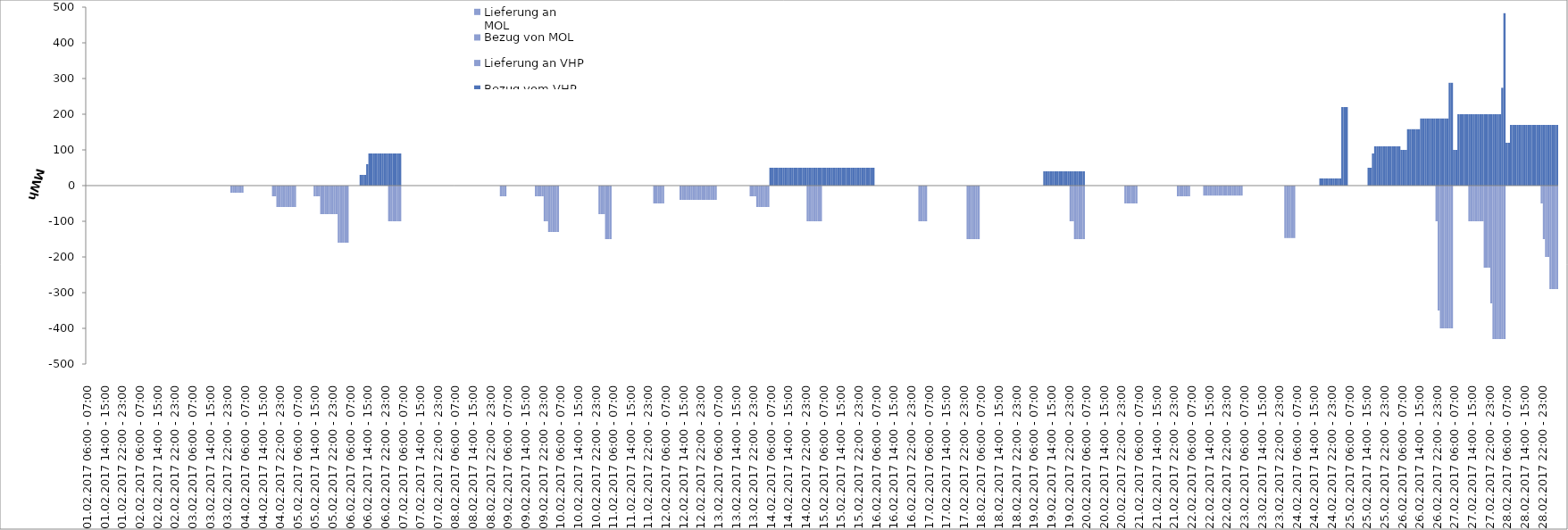
| Category | Bezug vom VHP | Lieferung an VHP | Bezug von MOL | Lieferung an MOL |
|---|---|---|---|---|
| 01.02.2017 06:00 - 07:00 | 0 | 0 | 0 | 0 |
| 01.02.2017 07:00 - 08:00 | 0 | 0 | 0 | 0 |
| 01.02.2017 08:00 - 09:00 | 0 | 0 | 0 | 0 |
| 01.02.2017 09:00 - 10:00 | 0 | 0 | 0 | 0 |
| 01.02.2017 10:00 - 11:00 | 0 | 0 | 0 | 0 |
| 01.02.2017 11:00 - 12:00 | 0 | 0 | 0 | 0 |
| 01.02.2017 12:00 - 13:00 | 0 | 0 | 0 | 0 |
| 01.02.2017 13:00 - 14:00 | 0 | 0 | 0 | 0 |
| 01.02.2017 14:00 - 15:00 | 0 | 0 | 0 | 0 |
| 01.02.2017 15:00 - 16:00 | 0 | 0 | 0 | 0 |
| 01.02.2017 16:00 - 17:00 | 0 | 0 | 0 | 0 |
| 01.02.2017 17:00 - 18:00 | 0 | 0 | 0 | 0 |
| 01.02.2017 18:00 - 19:00 | 0 | 0 | 0 | 0 |
| 01.02.2017 19:00 - 20:00 | 0 | 0 | 0 | 0 |
| 01.02.2017 20:00 - 21:00 | 0 | 0 | 0 | 0 |
| 01.02.2017 21:00 - 22:00 | 0 | 0 | 0 | 0 |
| 01.02.2017 22:00 - 23:00 | 0 | 0 | 0 | 0 |
| 01.02.2017 23:00 - 24:00 | 0 | 0 | 0 | 0 |
| 02.02.2017 00:00 - 01:00 | 0 | 0 | 0 | 0 |
| 02.02.2017 01:00 - 02:00 | 0 | 0 | 0 | 0 |
| 02.02.2017 02:00 - 03:00 | 0 | 0 | 0 | 0 |
| 02.02.2017 03:00 - 04:00 | 0 | 0 | 0 | 0 |
| 02.02.2017 04:00 - 05:00 | 0 | 0 | 0 | 0 |
| 02.02.2017 05:00 - 06:00 | 0 | 0 | 0 | 0 |
| 02.02.2017 06:00 - 07:00 | 0 | 0 | 0 | 0 |
| 02.02.2017 07:00 - 08:00 | 0 | 0 | 0 | 0 |
| 02.02.2017 08:00 - 09:00 | 0 | 0 | 0 | 0 |
| 02.02.2017 09:00 - 10:00 | 0 | 0 | 0 | 0 |
| 02.02.2017 10:00 - 11:00 | 0 | 0 | 0 | 0 |
| 02.02.2017 11:00 - 12:00 | 0 | 0 | 0 | 0 |
| 02.02.2017 12:00 - 13:00 | 0 | 0 | 0 | 0 |
| 02.02.2017 13:00 - 14:00 | 0 | 0 | 0 | 0 |
| 02.02.2017 14:00 - 15:00 | 0 | 0 | 0 | 0 |
| 02.02.2017 15:00 - 16:00 | 0 | 0 | 0 | 0 |
| 02.02.2017 16:00 - 17:00 | 0 | 0 | 0 | 0 |
| 02.02.2017 17:00 - 18:00 | 0 | 0 | 0 | 0 |
| 02.02.2017 18:00 - 19:00 | 0 | 0 | 0 | 0 |
| 02.02.2017 19:00 - 20:00 | 0 | 0 | 0 | 0 |
| 02.02.2017 20:00 - 21:00 | 0 | 0 | 0 | 0 |
| 02.02.2017 21:00 - 22:00 | 0 | 0 | 0 | 0 |
| 02.02.2017 22:00 - 23:00 | 0 | 0 | 0 | 0 |
| 02.02.2017 23:00 - 24:00 | 0 | 0 | 0 | 0 |
| 03.02.2017 00:00 - 01:00 | 0 | 0 | 0 | 0 |
| 03.02.2017 01:00 - 02:00 | 0 | 0 | 0 | 0 |
| 03.02.2017 02:00 - 03:00 | 0 | 0 | 0 | 0 |
| 03.02.2017 03:00 - 04:00 | 0 | 0 | 0 | 0 |
| 03.02.2017 04:00 - 05:00 | 0 | 0 | 0 | 0 |
| 03.02.2017 05:00 - 06:00 | 0 | 0 | 0 | 0 |
| 03.02.2017 06:00 - 07:00 | 0 | 0 | 0 | 0 |
| 03.02.2017 07:00 - 08:00 | 0 | 0 | 0 | 0 |
| 03.02.2017 08:00 - 09:00 | 0 | 0 | 0 | 0 |
| 03.02.2017 09:00 - 10:00 | 0 | 0 | 0 | 0 |
| 03.02.2017 10:00 - 11:00 | 0 | 0 | 0 | 0 |
| 03.02.2017 11:00 - 12:00 | 0 | 0 | 0 | 0 |
| 03.02.2017 12:00 - 13:00 | 0 | 0 | 0 | 0 |
| 03.02.2017 13:00 - 14:00 | 0 | 0 | 0 | 0 |
| 03.02.2017 14:00 - 15:00 | 0 | 0 | 0 | 0 |
| 03.02.2017 15:00 - 16:00 | 0 | 0 | 0 | 0 |
| 03.02.2017 16:00 - 17:00 | 0 | 0 | 0 | 0 |
| 03.02.2017 17:00 - 18:00 | 0 | 0 | 0 | 0 |
| 03.02.2017 18:00 - 19:00 | 0 | 0 | 0 | 0 |
| 03.02.2017 19:00 - 20:00 | 0 | 0 | 0 | 0 |
| 03.02.2017 20:00 - 21:00 | 0 | 0 | 0 | 0 |
| 03.02.2017 21:00 - 22:00 | 0 | 0 | 0 | 0 |
| 03.02.2017 22:00 - 23:00 | 0 | 0 | 0 | 0 |
| 03.02.2017 23:00 - 24:00 | 0 | 0 | 0 | 0 |
| 04.02.2017 00:00 - 01:00 | 0 | -20 | 0 | 0 |
| 04.02.2017 01:00 - 02:00 | 0 | -20 | 0 | 0 |
| 04.02.2017 02:00 - 03:00 | 0 | -20 | 0 | 0 |
| 04.02.2017 03:00 - 04:00 | 0 | -20 | 0 | 0 |
| 04.02.2017 04:00 - 05:00 | 0 | -20 | 0 | 0 |
| 04.02.2017 05:00 - 06:00 | 0 | -20 | 0 | 0 |
| 04.02.2017 06:00 - 07:00 | 0 | 0 | 0 | 0 |
| 04.02.2017 07:00 - 08:00 | 0 | 0 | 0 | 0 |
| 04.02.2017 08:00 - 09:00 | 0 | 0 | 0 | 0 |
| 04.02.2017 09:00 - 10:00 | 0 | 0 | 0 | 0 |
| 04.02.2017 10:00 - 11:00 | 0 | 0 | 0 | 0 |
| 04.02.2017 11:00 - 12:00 | 0 | 0 | 0 | 0 |
| 04.02.2017 12:00 - 13:00 | 0 | 0 | 0 | 0 |
| 04.02.2017 13:00 - 14:00 | 0 | 0 | 0 | 0 |
| 04.02.2017 14:00 - 15:00 | 0 | 0 | 0 | 0 |
| 04.02.2017 15:00 - 16:00 | 0 | 0 | 0 | 0 |
| 04.02.2017 16:00 - 17:00 | 0 | 0 | 0 | 0 |
| 04.02.2017 17:00 - 18:00 | 0 | 0 | 0 | 0 |
| 04.02.2017 18:00 - 19:00 | 0 | 0 | 0 | 0 |
| 04.02.2017 19:00 - 20:00 | 0 | -30 | 0 | 0 |
| 04.02.2017 20:00 - 21:00 | 0 | -30 | 0 | 0 |
| 04.02.2017 21:00 - 22:00 | 0 | -60 | 0 | 0 |
| 04.02.2017 22:00 - 23:00 | 0 | -60 | 0 | 0 |
| 04.02.2017 23:00 - 24:00 | 0 | -60 | 0 | 0 |
| 05.02.2017 00:00 - 01:00 | 0 | -60 | 0 | 0 |
| 05.02.2017 01:00 - 02:00 | 0 | -60 | 0 | 0 |
| 05.02.2017 02:00 - 03:00 | 0 | -60 | 0 | 0 |
| 05.02.2017 03:00 - 04:00 | 0 | -60 | 0 | 0 |
| 05.02.2017 04:00 - 05:00 | 0 | -60 | 0 | 0 |
| 05.02.2017 05:00 - 06:00 | 0 | -60 | 0 | 0 |
| 05.02.2017 06:00 - 07:00 | 0 | 0 | 0 | 0 |
| 05.02.2017 07:00 - 08:00 | 0 | 0 | 0 | 0 |
| 05.02.2017 08:00 - 09:00 | 0 | 0 | 0 | 0 |
| 05.02.2017 09:00 - 10:00 | 0 | 0 | 0 | 0 |
| 05.02.2017 10:00 - 11:00 | 0 | 0 | 0 | 0 |
| 05.02.2017 11:00 - 12:00 | 0 | 0 | 0 | 0 |
| 05.02.2017 12:00 - 13:00 | 0 | 0 | 0 | 0 |
| 05.02.2017 13:00 - 14:00 | 0 | 0 | 0 | 0 |
| 05.02.2017 14:00 - 15:00 | 0 | -30 | 0 | 0 |
| 05.02.2017 15:00 - 16:00 | 0 | -30 | 0 | 0 |
| 05.02.2017 16:00 - 17:00 | 0 | -30 | 0 | 0 |
| 05.02.2017 17:00 - 18:00 | 0 | -80 | 0 | 0 |
| 05.02.2017 18:00 - 19:00 | 0 | -80 | 0 | 0 |
| 05.02.2017 19:00 - 20:00 | 0 | -80 | 0 | 0 |
| 05.02.2017 20:00 - 21:00 | 0 | -80 | 0 | 0 |
| 05.02.2017 21:00 - 22:00 | 0 | -80 | 0 | 0 |
| 05.02.2017 22:00 - 23:00 | 0 | -80 | 0 | 0 |
| 05.02.2017 23:00 - 24:00 | 0 | -80 | 0 | 0 |
| 06.02.2017 00:00 - 01:00 | 0 | -80 | 0 | 0 |
| 06.02.2017 01:00 - 02:00 | 0 | -160 | 0 | 0 |
| 06.02.2017 02:00 - 03:00 | 0 | -160 | 0 | 0 |
| 06.02.2017 03:00 - 04:00 | 0 | -160 | 0 | 0 |
| 06.02.2017 04:00 - 05:00 | 0 | -160 | 0 | 0 |
| 06.02.2017 05:00 - 06:00 | 0 | -160 | 0 | 0 |
| 06.02.2017 06:00 - 07:00 | 0 | 0 | 0 | 0 |
| 06.02.2017 07:00 - 08:00 | 0 | 0 | 0 | 0 |
| 06.02.2017 08:00 - 09:00 | 0 | 0 | 0 | 0 |
| 06.02.2017 09:00 - 10:00 | 0 | 0 | 0 | 0 |
| 06.02.2017 10:00 - 11:00 | 0 | 0 | 0 | 0 |
| 06.02.2017 11:00 - 12:00 | 30 | 0 | 0 | 0 |
| 06.02.2017 12:00 - 13:00 | 30 | 0 | 0 | 0 |
| 06.02.2017 13:00 - 14:00 | 30 | 0 | 0 | 0 |
| 06.02.2017 14:00 - 15:00 | 60 | 0 | 0 | 0 |
| 06.02.2017 15:00 - 16:00 | 90 | 0 | 0 | 0 |
| 06.02.2017 16:00 - 17:00 | 90 | 0 | 0 | 0 |
| 06.02.2017 17:00 - 18:00 | 90 | 0 | 0 | 0 |
| 06.02.2017 18:00 - 19:00 | 90 | 0 | 0 | 0 |
| 06.02.2017 19:00 - 20:00 | 90 | 0 | 0 | 0 |
| 06.02.2017 20:00 - 21:00 | 90 | 0 | 0 | 0 |
| 06.02.2017 21:00 - 22:00 | 90 | 0 | 0 | 0 |
| 06.02.2017 22:00 - 23:00 | 90 | 0 | 0 | 0 |
| 06.02.2017 23:00 - 24:00 | 90 | 0 | 0 | 0 |
| 07.02.2017 00:00 - 01:00 | 90 | -100 | 0 | 0 |
| 07.02.2017 01:00 - 02:00 | 90 | -100 | 0 | 0 |
| 07.02.2017 02:00 - 03:00 | 90 | -100 | 0 | 0 |
| 07.02.2017 03:00 - 04:00 | 90 | -100 | 0 | 0 |
| 07.02.2017 04:00 - 05:00 | 90 | -100 | 0 | 0 |
| 07.02.2017 05:00 - 06:00 | 90 | -100 | 0 | 0 |
| 07.02.2017 06:00 - 07:00 | 0 | 0 | 0 | 0 |
| 07.02.2017 07:00 - 08:00 | 0 | 0 | 0 | 0 |
| 07.02.2017 08:00 - 09:00 | 0 | 0 | 0 | 0 |
| 07.02.2017 09:00 - 10:00 | 0 | 0 | 0 | 0 |
| 07.02.2017 10:00 - 11:00 | 0 | 0 | 0 | 0 |
| 07.02.2017 11:00 - 12:00 | 0 | 0 | 0 | 0 |
| 07.02.2017 12:00 - 13:00 | 0 | 0 | 0 | 0 |
| 07.02.2017 13:00 - 14:00 | 0 | 0 | 0 | 0 |
| 07.02.2017 14:00 - 15:00 | 0 | 0 | 0 | 0 |
| 07.02.2017 15:00 - 16:00 | 0 | 0 | 0 | 0 |
| 07.02.2017 16:00 - 17:00 | 0 | 0 | 0 | 0 |
| 07.02.2017 17:00 - 18:00 | 0 | 0 | 0 | 0 |
| 07.02.2017 18:00 - 19:00 | 0 | 0 | 0 | 0 |
| 07.02.2017 19:00 - 20:00 | 0 | 0 | 0 | 0 |
| 07.02.2017 20:00 - 21:00 | 0 | 0 | 0 | 0 |
| 07.02.2017 21:00 - 22:00 | 0 | 0 | 0 | 0 |
| 07.02.2017 22:00 - 23:00 | 0 | 0 | 0 | 0 |
| 07.02.2017 23:00 - 24:00 | 0 | 0 | 0 | 0 |
| 08.02.2017 00:00 - 01:00 | 0 | 0 | 0 | 0 |
| 08.02.2017 01:00 - 02:00 | 0 | 0 | 0 | 0 |
| 08.02.2017 02:00 - 03:00 | 0 | 0 | 0 | 0 |
| 08.02.2017 03:00 - 04:00 | 0 | 0 | 0 | 0 |
| 08.02.2017 04:00 - 05:00 | 0 | 0 | 0 | 0 |
| 08.02.2017 05:00 - 06:00 | 0 | 0 | 0 | 0 |
| 08.02.2017 06:00 - 07:00 | 0 | 0 | 0 | 0 |
| 08.02.2017 07:00 - 08:00 | 0 | 0 | 0 | 0 |
| 08.02.2017 08:00 - 09:00 | 0 | 0 | 0 | 0 |
| 08.02.2017 09:00 - 10:00 | 0 | 0 | 0 | 0 |
| 08.02.2017 10:00 - 11:00 | 0 | 0 | 0 | 0 |
| 08.02.2017 11:00 - 12:00 | 0 | 0 | 0 | 0 |
| 08.02.2017 12:00 - 13:00 | 0 | 0 | 0 | 0 |
| 08.02.2017 13:00 - 14:00 | 0 | 0 | 0 | 0 |
| 08.02.2017 14:00 - 15:00 | 0 | 0 | 0 | 0 |
| 08.02.2017 15:00 - 16:00 | 0 | 0 | 0 | 0 |
| 08.02.2017 16:00 - 17:00 | 0 | 0 | 0 | 0 |
| 08.02.2017 17:00 - 18:00 | 0 | 0 | 0 | 0 |
| 08.02.2017 18:00 - 19:00 | 0 | 0 | 0 | 0 |
| 08.02.2017 19:00 - 20:00 | 0 | 0 | 0 | 0 |
| 08.02.2017 20:00 - 21:00 | 0 | 0 | 0 | 0 |
| 08.02.2017 21:00 - 22:00 | 0 | 0 | 0 | 0 |
| 08.02.2017 22:00 - 23:00 | 0 | 0 | 0 | 0 |
| 08.02.2017 23:00 - 24:00 | 0 | 0 | 0 | 0 |
| 09.02.2017 00:00 - 01:00 | 0 | 0 | 0 | 0 |
| 09.02.2017 01:00 - 02:00 | 0 | 0 | 0 | 0 |
| 09.02.2017 02:00 - 03:00 | 0 | 0 | 0 | 0 |
| 09.02.2017 03:00 - 04:00 | 0 | -30 | 0 | 0 |
| 09.02.2017 04:00 - 05:00 | 0 | -30 | 0 | 0 |
| 09.02.2017 05:00 - 06:00 | 0 | -30 | 0 | 0 |
| 09.02.2017 06:00 - 07:00 | 0 | 0 | 0 | 0 |
| 09.02.2017 07:00 - 08:00 | 0 | 0 | 0 | 0 |
| 09.02.2017 08:00 - 09:00 | 0 | 0 | 0 | 0 |
| 09.02.2017 09:00 - 10:00 | 0 | 0 | 0 | 0 |
| 09.02.2017 10:00 - 11:00 | 0 | 0 | 0 | 0 |
| 09.02.2017 11:00 - 12:00 | 0 | 0 | 0 | 0 |
| 09.02.2017 12:00 - 13:00 | 0 | 0 | 0 | 0 |
| 09.02.2017 13:00 - 14:00 | 0 | 0 | 0 | 0 |
| 09.02.2017 14:00 - 15:00 | 0 | 0 | 0 | 0 |
| 09.02.2017 15:00 - 16:00 | 0 | 0 | 0 | 0 |
| 09.02.2017 16:00 - 17:00 | 0 | 0 | 0 | 0 |
| 09.02.2017 17:00 - 18:00 | 0 | 0 | 0 | 0 |
| 09.02.2017 18:00 - 19:00 | 0 | 0 | 0 | 0 |
| 09.02.2017 19:00 - 20:00 | 0 | -30 | 0 | 0 |
| 09.02.2017 20:00 - 21:00 | 0 | -30 | 0 | 0 |
| 09.02.2017 21:00 - 22:00 | 0 | -30 | 0 | 0 |
| 09.02.2017 22:00 - 23:00 | 0 | -30 | 0 | 0 |
| 09.02.2017 23:00 - 24:00 | 0 | -100 | 0 | 0 |
| 10.02.2017 00:00 - 01:00 | 0 | -100 | 0 | 0 |
| 10.02.2017 01:00 - 02:00 | 0 | -130 | 0 | 0 |
| 10.02.2017 02:00 - 03:00 | 0 | -130 | 0 | 0 |
| 10.02.2017 03:00 - 04:00 | 0 | -130 | 0 | 0 |
| 10.02.2017 04:00 - 05:00 | 0 | -130 | 0 | 0 |
| 10.02.2017 05:00 - 06:00 | 0 | -130 | 0 | 0 |
| 10.02.2017 06:00 - 07:00 | 0 | 0 | 0 | 0 |
| 10.02.2017 07:00 - 08:00 | 0 | 0 | 0 | 0 |
| 10.02.2017 08:00 - 09:00 | 0 | 0 | 0 | 0 |
| 10.02.2017 09:00 - 10:00 | 0 | 0 | 0 | 0 |
| 10.02.2017 10:00 - 11:00 | 0 | 0 | 0 | 0 |
| 10.02.2017 11:00 - 12:00 | 0 | 0 | 0 | 0 |
| 10.02.2017 12:00 - 13:00 | 0 | 0 | 0 | 0 |
| 10.02.2017 13:00 - 14:00 | 0 | 0 | 0 | 0 |
| 10.02.2017 14:00 - 15:00 | 0 | 0 | 0 | 0 |
| 10.02.2017 15:00 - 16:00 | 0 | 0 | 0 | 0 |
| 10.02.2017 16:00 - 17:00 | 0 | 0 | 0 | 0 |
| 10.02.2017 17:00 - 18:00 | 0 | 0 | 0 | 0 |
| 10.02.2017 18:00 - 19:00 | 0 | 0 | 0 | 0 |
| 10.02.2017 19:00 - 20:00 | 0 | 0 | 0 | 0 |
| 10.02.2017 20:00 - 21:00 | 0 | 0 | 0 | 0 |
| 10.02.2017 21:00 - 22:00 | 0 | 0 | 0 | 0 |
| 10.02.2017 22:00 - 23:00 | 0 | 0 | 0 | 0 |
| 10.02.2017 23:00 - 24:00 | 0 | 0 | 0 | 0 |
| 11.02.2017 00:00 - 01:00 | 0 | -80 | 0 | 0 |
| 11.02.2017 01:00 - 02:00 | 0 | -80 | 0 | 0 |
| 11.02.2017 02:00 - 03:00 | 0 | -80 | 0 | 0 |
| 11.02.2017 03:00 - 04:00 | 0 | -150 | 0 | 0 |
| 11.02.2017 04:00 - 05:00 | 0 | -150 | 0 | 0 |
| 11.02.2017 05:00 - 06:00 | 0 | -150 | 0 | 0 |
| 11.02.2017 06:00 - 07:00 | 0 | 0 | 0 | 0 |
| 11.02.2017 07:00 - 08:00 | 0 | 0 | 0 | 0 |
| 11.02.2017 08:00 - 09:00 | 0 | 0 | 0 | 0 |
| 11.02.2017 09:00 - 10:00 | 0 | 0 | 0 | 0 |
| 11.02.2017 10:00 - 11:00 | 0 | 0 | 0 | 0 |
| 11.02.2017 11:00 - 12:00 | 0 | 0 | 0 | 0 |
| 11.02.2017 12:00 - 13:00 | 0 | 0 | 0 | 0 |
| 11.02.2017 13:00 - 14:00 | 0 | 0 | 0 | 0 |
| 11.02.2017 14:00 - 15:00 | 0 | 0 | 0 | 0 |
| 11.02.2017 15:00 - 16:00 | 0 | 0 | 0 | 0 |
| 11.02.2017 16:00 - 17:00 | 0 | 0 | 0 | 0 |
| 11.02.2017 17:00 - 18:00 | 0 | 0 | 0 | 0 |
| 11.02.2017 18:00 - 19:00 | 0 | 0 | 0 | 0 |
| 11.02.2017 19:00 - 20:00 | 0 | 0 | 0 | 0 |
| 11.02.2017 20:00 - 21:00 | 0 | 0 | 0 | 0 |
| 11.02.2017 21:00 - 22:00 | 0 | 0 | 0 | 0 |
| 11.02.2017 22:00 - 23:00 | 0 | 0 | 0 | 0 |
| 11.02.2017 23:00 - 24:00 | 0 | 0 | 0 | 0 |
| 12.02.2017 00:00 - 01:00 | 0 | 0 | 0 | 0 |
| 12.02.2017 01:00 - 02:00 | 0 | -50 | 0 | 0 |
| 12.02.2017 02:00 - 03:00 | 0 | -50 | 0 | 0 |
| 12.02.2017 03:00 - 04:00 | 0 | -50 | 0 | 0 |
| 12.02.2017 04:00 - 05:00 | 0 | -50 | 0 | 0 |
| 12.02.2017 05:00 - 06:00 | 0 | -50 | 0 | 0 |
| 12.02.2017 06:00 - 07:00 | 0 | 0 | 0 | 0 |
| 12.02.2017 07:00 - 08:00 | 0 | 0 | 0 | 0 |
| 12.02.2017 08:00 - 09:00 | 0 | 0 | 0 | 0 |
| 12.02.2017 09:00 - 10:00 | 0 | 0 | 0 | 0 |
| 12.02.2017 10:00 - 11:00 | 0 | 0 | 0 | 0 |
| 12.02.2017 11:00 - 12:00 | 0 | 0 | 0 | 0 |
| 12.02.2017 12:00 - 13:00 | 0 | 0 | 0 | 0 |
| 12.02.2017 13:00 - 14:00 | 0 | -40 | 0 | 0 |
| 12.02.2017 14:00 - 15:00 | 0 | -40 | 0 | 0 |
| 12.02.2017 15:00 - 16:00 | 0 | -40 | 0 | 0 |
| 12.02.2017 16:00 - 17:00 | 0 | -40 | 0 | 0 |
| 12.02.2017 17:00 - 18:00 | 0 | -40 | 0 | 0 |
| 12.02.2017 18:00 - 19:00 | 0 | -40 | 0 | 0 |
| 12.02.2017 19:00 - 20:00 | 0 | -40 | 0 | 0 |
| 12.02.2017 20:00 - 21:00 | 0 | -40 | 0 | 0 |
| 12.02.2017 21:00 - 22:00 | 0 | -40 | 0 | 0 |
| 12.02.2017 22:00 - 23:00 | 0 | -40 | 0 | 0 |
| 12.02.2017 23:00 - 24:00 | 0 | -40 | 0 | 0 |
| 13.02.2017 00:00 - 01:00 | 0 | -40 | 0 | 0 |
| 13.02.2017 01:00 - 02:00 | 0 | -40 | 0 | 0 |
| 13.02.2017 02:00 - 03:00 | 0 | -40 | 0 | 0 |
| 13.02.2017 03:00 - 04:00 | 0 | -40 | 0 | 0 |
| 13.02.2017 04:00 - 05:00 | 0 | -40 | 0 | 0 |
| 13.02.2017 05:00 - 06:00 | 0 | -40 | 0 | 0 |
| 13.02.2017 06:00 - 07:00 | 0 | 0 | 0 | 0 |
| 13.02.2017 07:00 - 08:00 | 0 | 0 | 0 | 0 |
| 13.02.2017 08:00 - 09:00 | 0 | 0 | 0 | 0 |
| 13.02.2017 09:00 - 10:00 | 0 | 0 | 0 | 0 |
| 13.02.2017 10:00 - 11:00 | 0 | 0 | 0 | 0 |
| 13.02.2017 11:00 - 12:00 | 0 | 0 | 0 | 0 |
| 13.02.2017 12:00 - 13:00 | 0 | 0 | 0 | 0 |
| 13.02.2017 13:00 - 14:00 | 0 | 0 | 0 | 0 |
| 13.02.2017 14:00 - 15:00 | 0 | 0 | 0 | 0 |
| 13.02.2017 15:00 - 16:00 | 0 | 0 | 0 | 0 |
| 13.02.2017 16:00 - 17:00 | 0 | 0 | 0 | 0 |
| 13.02.2017 17:00 - 18:00 | 0 | 0 | 0 | 0 |
| 13.02.2017 18:00 - 19:00 | 0 | 0 | 0 | 0 |
| 13.02.2017 19:00 - 20:00 | 0 | 0 | 0 | 0 |
| 13.02.2017 20:00 - 21:00 | 0 | 0 | 0 | 0 |
| 13.02.2017 21:00 - 22:00 | 0 | -30 | 0 | 0 |
| 13.02.2017 22:00 - 23:00 | 0 | -30 | 0 | 0 |
| 13.02.2017 23:00 - 24:00 | 0 | -30 | 0 | 0 |
| 14.02.2017 00:00 - 01:00 | 0 | -60 | 0 | 0 |
| 14.02.2017 01:00 - 02:00 | 0 | -60 | 0 | 0 |
| 14.02.2017 02:00 - 03:00 | 0 | -60 | 0 | 0 |
| 14.02.2017 03:00 - 04:00 | 0 | -60 | 0 | 0 |
| 14.02.2017 04:00 - 05:00 | 0 | -60 | 0 | 0 |
| 14.02.2017 05:00 - 06:00 | 0 | -60 | 0 | 0 |
| 14.02.2017 06:00 - 07:00 | 50 | 0 | 0 | 0 |
| 14.02.2017 07:00 - 08:00 | 50 | 0 | 0 | 0 |
| 14.02.2017 08:00 - 09:00 | 50 | 0 | 0 | 0 |
| 14.02.2017 09:00 - 10:00 | 50 | 0 | 0 | 0 |
| 14.02.2017 10:00 - 11:00 | 50 | 0 | 0 | 0 |
| 14.02.2017 11:00 - 12:00 | 50 | 0 | 0 | 0 |
| 14.02.2017 12:00 - 13:00 | 50 | 0 | 0 | 0 |
| 14.02.2017 13:00 - 14:00 | 50 | 0 | 0 | 0 |
| 14.02.2017 14:00 - 15:00 | 50 | 0 | 0 | 0 |
| 14.02.2017 15:00 - 16:00 | 50 | 0 | 0 | 0 |
| 14.02.2017 16:00 - 17:00 | 50 | 0 | 0 | 0 |
| 14.02.2017 17:00 - 18:00 | 50 | 0 | 0 | 0 |
| 14.02.2017 18:00 - 19:00 | 50 | 0 | 0 | 0 |
| 14.02.2017 19:00 - 20:00 | 50 | 0 | 0 | 0 |
| 14.02.2017 20:00 - 21:00 | 50 | 0 | 0 | 0 |
| 14.02.2017 21:00 - 22:00 | 50 | 0 | 0 | 0 |
| 14.02.2017 22:00 - 23:00 | 50 | 0 | 0 | 0 |
| 14.02.2017 23:00 - 24:00 | 50 | -100 | 0 | 0 |
| 15.02.2017 00:00 - 01:00 | 50 | -100 | 0 | 0 |
| 15.02.2017 01:00 - 02:00 | 50 | -100 | 0 | 0 |
| 15.02.2017 02:00 - 03:00 | 50 | -100 | 0 | 0 |
| 15.02.2017 03:00 - 04:00 | 50 | -100 | 0 | 0 |
| 15.02.2017 04:00 - 05:00 | 50 | -100 | 0 | 0 |
| 15.02.2017 05:00 - 06:00 | 50 | -100 | 0 | 0 |
| 15.02.2017 06:00 - 07:00 | 50 | 0 | 0 | 0 |
| 15.02.2017 07:00 - 08:00 | 50 | 0 | 0 | 0 |
| 15.02.2017 08:00 - 09:00 | 50 | 0 | 0 | 0 |
| 15.02.2017 09:00 - 10:00 | 50 | 0 | 0 | 0 |
| 15.02.2017 10:00 - 11:00 | 50 | 0 | 0 | 0 |
| 15.02.2017 11:00 - 12:00 | 50 | 0 | 0 | 0 |
| 15.02.2017 12:00 - 13:00 | 50 | 0 | 0 | 0 |
| 15.02.2017 13:00 - 14:00 | 50 | 0 | 0 | 0 |
| 15.02.2017 14:00 - 15:00 | 50 | 0 | 0 | 0 |
| 15.02.2017 15:00 - 16:00 | 50 | 0 | 0 | 0 |
| 15.02.2017 16:00 - 17:00 | 50 | 0 | 0 | 0 |
| 15.02.2017 17:00 - 18:00 | 50 | 0 | 0 | 0 |
| 15.02.2017 18:00 - 19:00 | 50 | 0 | 0 | 0 |
| 15.02.2017 19:00 - 20:00 | 50 | 0 | 0 | 0 |
| 15.02.2017 20:00 - 21:00 | 50 | 0 | 0 | 0 |
| 15.02.2017 21:00 - 22:00 | 50 | 0 | 0 | 0 |
| 15.02.2017 22:00 - 23:00 | 50 | 0 | 0 | 0 |
| 15.02.2017 23:00 - 24:00 | 50 | 0 | 0 | 0 |
| 16.02.2017 00:00 - 01:00 | 50 | 0 | 0 | 0 |
| 16.02.2017 01:00 - 02:00 | 50 | 0 | 0 | 0 |
| 16.02.2017 02:00 - 03:00 | 50 | 0 | 0 | 0 |
| 16.02.2017 03:00 - 04:00 | 50 | 0 | 0 | 0 |
| 16.02.2017 04:00 - 05:00 | 50 | 0 | 0 | 0 |
| 16.02.2017 05:00 - 06:00 | 50 | 0 | 0 | 0 |
| 16.02.2017 06:00 - 07:00 | 0 | 0 | 0 | 0 |
| 16.02.2017 07:00 - 08:00 | 0 | 0 | 0 | 0 |
| 16.02.2017 08:00 - 09:00 | 0 | 0 | 0 | 0 |
| 16.02.2017 09:00 - 10:00 | 0 | 0 | 0 | 0 |
| 16.02.2017 10:00 - 11:00 | 0 | 0 | 0 | 0 |
| 16.02.2017 11:00 - 12:00 | 0 | 0 | 0 | 0 |
| 16.02.2017 12:00 - 13:00 | 0 | 0 | 0 | 0 |
| 16.02.2017 13:00 - 14:00 | 0 | 0 | 0 | 0 |
| 16.02.2017 14:00 - 15:00 | 0 | 0 | 0 | 0 |
| 16.02.2017 15:00 - 16:00 | 0 | 0 | 0 | 0 |
| 16.02.2017 16:00 - 17:00 | 0 | 0 | 0 | 0 |
| 16.02.2017 17:00 - 18:00 | 0 | 0 | 0 | 0 |
| 16.02.2017 18:00 - 19:00 | 0 | 0 | 0 | 0 |
| 16.02.2017 19:00 - 20:00 | 0 | 0 | 0 | 0 |
| 16.02.2017 20:00 - 21:00 | 0 | 0 | 0 | 0 |
| 16.02.2017 21:00 - 22:00 | 0 | 0 | 0 | 0 |
| 16.02.2017 22:00 - 23:00 | 0 | 0 | 0 | 0 |
| 16.02.2017 23:00 - 24:00 | 0 | 0 | 0 | 0 |
| 17.02.2017 00:00 - 01:00 | 0 | 0 | 0 | 0 |
| 17.02.2017 01:00 - 02:00 | 0 | 0 | 0 | 0 |
| 17.02.2017 02:00 - 03:00 | 0 | -100 | 0 | 0 |
| 17.02.2017 03:00 - 04:00 | 0 | -100 | 0 | 0 |
| 17.02.2017 04:00 - 05:00 | 0 | -100 | 0 | 0 |
| 17.02.2017 05:00 - 06:00 | 0 | -100 | 0 | 0 |
| 17.02.2017 06:00 - 07:00 | 0 | 0 | 0 | 0 |
| 17.02.2017 07:00 - 08:00 | 0 | 0 | 0 | 0 |
| 17.02.2017 08:00 - 09:00 | 0 | 0 | 0 | 0 |
| 17.02.2017 09:00 - 10:00 | 0 | 0 | 0 | 0 |
| 17.02.2017 10:00 - 11:00 | 0 | 0 | 0 | 0 |
| 17.02.2017 11:00 - 12:00 | 0 | 0 | 0 | 0 |
| 17.02.2017 12:00 - 13:00 | 0 | 0 | 0 | 0 |
| 17.02.2017 13:00 - 14:00 | 0 | 0 | 0 | 0 |
| 17.02.2017 14:00 - 15:00 | 0 | 0 | 0 | 0 |
| 17.02.2017 15:00 - 16:00 | 0 | 0 | 0 | 0 |
| 17.02.2017 16:00 - 17:00 | 0 | 0 | 0 | 0 |
| 17.02.2017 17:00 - 18:00 | 0 | 0 | 0 | 0 |
| 17.02.2017 18:00 - 19:00 | 0 | 0 | 0 | 0 |
| 17.02.2017 19:00 - 20:00 | 0 | 0 | 0 | 0 |
| 17.02.2017 20:00 - 21:00 | 0 | 0 | 0 | 0 |
| 17.02.2017 21:00 - 22:00 | 0 | 0 | 0 | 0 |
| 17.02.2017 22:00 - 23:00 | 0 | 0 | 0 | 0 |
| 17.02.2017 23:00 - 24:00 | 0 | 0 | 0 | 0 |
| 18.02.2017 00:00 - 01:00 | 0 | -150 | 0 | 0 |
| 18.02.2017 01:00 - 02:00 | 0 | -150 | 0 | 0 |
| 18.02.2017 02:00 - 03:00 | 0 | -150 | 0 | 0 |
| 18.02.2017 03:00 - 04:00 | 0 | -150 | 0 | 0 |
| 18.02.2017 04:00 - 05:00 | 0 | -150 | 0 | 0 |
| 18.02.2017 05:00 - 06:00 | 0 | -150 | 0 | 0 |
| 18.02.2017 06:00 - 07:00 | 0 | 0 | 0 | 0 |
| 18.02.2017 07:00 - 08:00 | 0 | 0 | 0 | 0 |
| 18.02.2017 08:00 - 09:00 | 0 | 0 | 0 | 0 |
| 18.02.2017 09:00 - 10:00 | 0 | 0 | 0 | 0 |
| 18.02.2017 10:00 - 11:00 | 0 | 0 | 0 | 0 |
| 18.02.2017 11:00 - 12:00 | 0 | 0 | 0 | 0 |
| 18.02.2017 12:00 - 13:00 | 0 | 0 | 0 | 0 |
| 18.02.2017 13:00 - 14:00 | 0 | 0 | 0 | 0 |
| 18.02.2017 14:00 - 15:00 | 0 | 0 | 0 | 0 |
| 18.02.2017 15:00 - 16:00 | 0 | 0 | 0 | 0 |
| 18.02.2017 16:00 - 17:00 | 0 | 0 | 0 | 0 |
| 18.02.2017 17:00 - 18:00 | 0 | 0 | 0 | 0 |
| 18.02.2017 18:00 - 19:00 | 0 | 0 | 0 | 0 |
| 18.02.2017 19:00 - 20:00 | 0 | 0 | 0 | 0 |
| 18.02.2017 20:00 - 21:00 | 0 | 0 | 0 | 0 |
| 18.02.2017 21:00 - 22:00 | 0 | 0 | 0 | 0 |
| 18.02.2017 22:00 - 23:00 | 0 | 0 | 0 | 0 |
| 18.02.2017 23:00 - 24:00 | 0 | 0 | 0 | 0 |
| 19.02.2017 00:00 - 01:00 | 0 | 0 | 0 | 0 |
| 19.02.2017 01:00 - 02:00 | 0 | 0 | 0 | 0 |
| 19.02.2017 02:00 - 03:00 | 0 | 0 | 0 | 0 |
| 19.02.2017 03:00 - 04:00 | 0 | 0 | 0 | 0 |
| 19.02.2017 04:00 - 05:00 | 0 | 0 | 0 | 0 |
| 19.02.2017 05:00 - 06:00 | 0 | 0 | 0 | 0 |
| 19.02.2017 06:00 - 07:00 | 0 | 0 | 0 | 0 |
| 19.02.2017 07:00 - 08:00 | 0 | 0 | 0 | 0 |
| 19.02.2017 08:00 - 09:00 | 0 | 0 | 0 | 0 |
| 19.02.2017 09:00 - 10:00 | 0 | 0 | 0 | 0 |
| 19.02.2017 10:00 - 11:00 | 0 | 0 | 0 | 0 |
| 19.02.2017 11:00 - 12:00 | 40 | 0 | 0 | 0 |
| 19.02.2017 12:00 - 13:00 | 40 | 0 | 0 | 0 |
| 19.02.2017 13:00 - 14:00 | 40 | 0 | 0 | 0 |
| 19.02.2017 14:00 - 15:00 | 40 | 0 | 0 | 0 |
| 19.02.2017 15:00 - 16:00 | 40 | 0 | 0 | 0 |
| 19.02.2017 16:00 - 17:00 | 40 | 0 | 0 | 0 |
| 19.02.2017 17:00 - 18:00 | 40 | 0 | 0 | 0 |
| 19.02.2017 18:00 - 19:00 | 40 | 0 | 0 | 0 |
| 19.02.2017 19:00 - 20:00 | 40 | 0 | 0 | 0 |
| 19.02.2017 20:00 - 21:00 | 40 | 0 | 0 | 0 |
| 19.02.2017 21:00 - 22:00 | 40 | 0 | 0 | 0 |
| 19.02.2017 22:00 - 23:00 | 40 | 0 | 0 | 0 |
| 19.02.2017 23:00 - 24:00 | 40 | -100 | 0 | 0 |
| 20.02.2017 00:00 - 01:00 | 40 | -100 | 0 | 0 |
| 20.02.2017 01:00 - 02:00 | 40 | -150 | 0 | 0 |
| 20.02.2017 02:00 - 03:00 | 40 | -150 | 0 | 0 |
| 20.02.2017 03:00 - 04:00 | 40 | -150 | 0 | 0 |
| 20.02.2017 04:00 - 05:00 | 40 | -150 | 0 | 0 |
| 20.02.2017 05:00 - 06:00 | 40 | -150 | 0 | 0 |
| 20.02.2017 06:00 - 07:00 | 0 | 0 | 0 | 0 |
| 20.02.2017 07:00 - 08:00 | 0 | 0 | 0 | 0 |
| 20.02.2017 08:00 - 09:00 | 0 | 0 | 0 | 0 |
| 20.02.2017 09:00 - 10:00 | 0 | 0 | 0 | 0 |
| 20.02.2017 10:00 - 11:00 | 0 | 0 | 0 | 0 |
| 20.02.2017 11:00 - 12:00 | 0 | 0 | 0 | 0 |
| 20.02.2017 12:00 - 13:00 | 0 | 0 | 0 | 0 |
| 20.02.2017 13:00 - 14:00 | 0 | 0 | 0 | 0 |
| 20.02.2017 14:00 - 15:00 | 0 | 0 | 0 | 0 |
| 20.02.2017 15:00 - 16:00 | 0 | 0 | 0 | 0 |
| 20.02.2017 16:00 - 17:00 | 0 | 0 | 0 | 0 |
| 20.02.2017 17:00 - 18:00 | 0 | 0 | 0 | 0 |
| 20.02.2017 18:00 - 19:00 | 0 | 0 | 0 | 0 |
| 20.02.2017 19:00 - 20:00 | 0 | 0 | 0 | 0 |
| 20.02.2017 20:00 - 21:00 | 0 | 0 | 0 | 0 |
| 20.02.2017 21:00 - 22:00 | 0 | 0 | 0 | 0 |
| 20.02.2017 22:00 - 23:00 | 0 | 0 | 0 | 0 |
| 20.02.2017 23:00 - 24:00 | 0 | 0 | 0 | 0 |
| 21.02.2017 00:00 - 01:00 | 0 | -50 | 0 | 0 |
| 21.02.2017 01:00 - 02:00 | 0 | -50 | 0 | 0 |
| 21.02.2017 02:00 - 03:00 | 0 | -50 | 0 | 0 |
| 21.02.2017 03:00 - 04:00 | 0 | -50 | 0 | 0 |
| 21.02.2017 04:00 - 05:00 | 0 | -50 | 0 | 0 |
| 21.02.2017 05:00 - 06:00 | 0 | -50 | 0 | 0 |
| 21.02.2017 06:00 - 07:00 | 0 | 0 | 0 | 0 |
| 21.02.2017 07:00 - 08:00 | 0 | 0 | 0 | 0 |
| 21.02.2017 08:00 - 09:00 | 0 | 0 | 0 | 0 |
| 21.02.2017 09:00 - 10:00 | 0 | 0 | 0 | 0 |
| 21.02.2017 10:00 - 11:00 | 0 | 0 | 0 | 0 |
| 21.02.2017 11:00 - 12:00 | 0 | 0 | 0 | 0 |
| 21.02.2017 12:00 - 13:00 | 0 | 0 | 0 | 0 |
| 21.02.2017 13:00 - 14:00 | 0 | 0 | 0 | 0 |
| 21.02.2017 14:00 - 15:00 | 0 | 0 | 0 | 0 |
| 21.02.2017 15:00 - 16:00 | 0 | 0 | 0 | 0 |
| 21.02.2017 16:00 - 17:00 | 0 | 0 | 0 | 0 |
| 21.02.2017 17:00 - 18:00 | 0 | 0 | 0 | 0 |
| 21.02.2017 18:00 - 19:00 | 0 | 0 | 0 | 0 |
| 21.02.2017 19:00 - 20:00 | 0 | 0 | 0 | 0 |
| 21.02.2017 20:00 - 21:00 | 0 | 0 | 0 | 0 |
| 21.02.2017 21:00 - 22:00 | 0 | 0 | 0 | 0 |
| 21.02.2017 22:00 - 23:00 | 0 | 0 | 0 | 0 |
| 21.02.2017 23:00 - 24:00 | 0 | 0 | 0 | 0 |
| 22.02.2017 00:00 - 01:00 | 0 | -30 | 0 | 0 |
| 22.02.2017 01:00 - 02:00 | 0 | -30 | 0 | 0 |
| 22.02.2017 02:00 - 03:00 | 0 | -30 | 0 | 0 |
| 22.02.2017 03:00 - 04:00 | 0 | -30 | 0 | 0 |
| 22.02.2017 04:00 - 05:00 | 0 | -30 | 0 | 0 |
| 22.02.2017 05:00 - 06:00 | 0 | -30 | 0 | 0 |
| 22.02.2017 06:00 - 07:00 | 0 | 0 | 0 | 0 |
| 22.02.2017 07:00 - 08:00 | 0 | 0 | 0 | 0 |
| 22.02.2017 08:00 - 09:00 | 0 | 0 | 0 | 0 |
| 22.02.2017 09:00 - 10:00 | 0 | 0 | 0 | 0 |
| 22.02.2017 10:00 - 11:00 | 0 | 0 | 0 | 0 |
| 22.02.2017 11:00 - 12:00 | 0 | 0 | 0 | 0 |
| 22.02.2017 12:00 - 13:00 | 0 | -28 | 0 | 0 |
| 22.02.2017 13:00 - 14:00 | 0 | -28 | 0 | 0 |
| 22.02.2017 14:00 - 15:00 | 0 | -28 | 0 | 0 |
| 22.02.2017 15:00 - 16:00 | 0 | -28 | 0 | 0 |
| 22.02.2017 16:00 - 17:00 | 0 | -28 | 0 | 0 |
| 22.02.2017 17:00 - 18:00 | 0 | -28 | 0 | 0 |
| 22.02.2017 18:00 - 19:00 | 0 | -28 | 0 | 0 |
| 22.02.2017 19:00 - 20:00 | 0 | -28 | 0 | 0 |
| 22.02.2017 20:00 - 21:00 | 0 | -28 | 0 | 0 |
| 22.02.2017 21:00 - 22:00 | 0 | -28 | 0 | 0 |
| 22.02.2017 22:00 - 23:00 | 0 | -28 | 0 | 0 |
| 22.02.2017 23:00 - 24:00 | 0 | -28 | 0 | 0 |
| 23.02.2017 00:00 - 01:00 | 0 | -28 | 0 | 0 |
| 23.02.2017 01:00 - 02:00 | 0 | -28 | 0 | 0 |
| 23.02.2017 02:00 - 03:00 | 0 | -28 | 0 | 0 |
| 23.02.2017 03:00 - 04:00 | 0 | -28 | 0 | 0 |
| 23.02.2017 04:00 - 05:00 | 0 | -28 | 0 | 0 |
| 23.02.2017 05:00 - 06:00 | 0 | -28 | 0 | 0 |
| 23.02.2017 06:00 - 07:00 | 0 | 0 | 0 | 0 |
| 23.02.2017 07:00 - 08:00 | 0 | 0 | 0 | 0 |
| 23.02.2017 08:00 - 09:00 | 0 | 0 | 0 | 0 |
| 23.02.2017 09:00 - 10:00 | 0 | 0 | 0 | 0 |
| 23.02.2017 10:00 - 11:00 | 0 | 0 | 0 | 0 |
| 23.02.2017 11:00 - 12:00 | 0 | 0 | 0 | 0 |
| 23.02.2017 12:00 - 13:00 | 0 | 0 | 0 | 0 |
| 23.02.2017 13:00 - 14:00 | 0 | 0 | 0 | 0 |
| 23.02.2017 14:00 - 15:00 | 0 | 0 | 0 | 0 |
| 23.02.2017 15:00 - 16:00 | 0 | 0 | 0 | 0 |
| 23.02.2017 16:00 - 17:00 | 0 | 0 | 0 | 0 |
| 23.02.2017 17:00 - 18:00 | 0 | 0 | 0 | 0 |
| 23.02.2017 18:00 - 19:00 | 0 | 0 | 0 | 0 |
| 23.02.2017 19:00 - 20:00 | 0 | 0 | 0 | 0 |
| 23.02.2017 20:00 - 21:00 | 0 | 0 | 0 | 0 |
| 23.02.2017 21:00 - 22:00 | 0 | 0 | 0 | 0 |
| 23.02.2017 22:00 - 23:00 | 0 | 0 | 0 | 0 |
| 23.02.2017 23:00 - 24:00 | 0 | 0 | 0 | 0 |
| 24.02.2017 00:00 - 01:00 | 0 | 0 | 0 | 0 |
| 24.02.2017 01:00 - 02:00 | 0 | -147 | 0 | 0 |
| 24.02.2017 02:00 - 03:00 | 0 | -147 | 0 | 0 |
| 24.02.2017 03:00 - 04:00 | 0 | -147 | 0 | 0 |
| 24.02.2017 04:00 - 05:00 | 0 | -147 | 0 | 0 |
| 24.02.2017 05:00 - 06:00 | 0 | -147 | 0 | 0 |
| 24.02.2017 06:00 - 07:00 | 0 | 0 | 0 | 0 |
| 24.02.2017 07:00 - 08:00 | 0 | 0 | 0 | 0 |
| 24.02.2017 08:00 - 09:00 | 0 | 0 | 0 | 0 |
| 24.02.2017 09:00 - 10:00 | 0 | 0 | 0 | 0 |
| 24.02.2017 10:00 - 11:00 | 0 | 0 | 0 | 0 |
| 24.02.2017 11:00 - 12:00 | 0 | 0 | 0 | 0 |
| 24.02.2017 12:00 - 13:00 | 0 | 0 | 0 | 0 |
| 24.02.2017 13:00 - 14:00 | 0 | 0 | 0 | 0 |
| 24.02.2017 14:00 - 15:00 | 0 | 0 | 0 | 0 |
| 24.02.2017 15:00 - 16:00 | 0 | 0 | 0 | 0 |
| 24.02.2017 16:00 - 17:00 | 0 | 0 | 0 | 0 |
| 24.02.2017 17:00 - 18:00 | 20 | 0 | 0 | 0 |
| 24.02.2017 18:00 - 19:00 | 20 | 0 | 0 | 0 |
| 24.02.2017 19:00 - 20:00 | 20 | 0 | 0 | 0 |
| 24.02.2017 20:00 - 21:00 | 20 | 0 | 0 | 0 |
| 24.02.2017 21:00 - 22:00 | 20 | 0 | 0 | 0 |
| 24.02.2017 22:00 - 23:00 | 20 | 0 | 0 | 0 |
| 24.02.2017 23:00 - 24:00 | 20 | 0 | 0 | 0 |
| 25.02.2017 00:00 - 01:00 | 20 | 0 | 0 | 0 |
| 25.02.2017 01:00 - 02:00 | 20 | 0 | 0 | 0 |
| 25.02.2017 02:00 - 03:00 | 20 | 0 | 0 | 0 |
| 25.02.2017 03:00 - 04:00 | 220 | 0 | 0 | 0 |
| 25.02.2017 04:00 - 05:00 | 220 | 0 | 0 | 0 |
| 25.02.2017 05:00 - 06:00 | 220 | 0 | 0 | 0 |
| 25.02.2017 06:00 - 07:00 | 0 | 0 | 0 | 0 |
| 25.02.2017 07:00 - 08:00 | 0 | 0 | 0 | 0 |
| 25.02.2017 08:00 - 09:00 | 0 | 0 | 0 | 0 |
| 25.02.2017 09:00 - 10:00 | 0 | 0 | 0 | 0 |
| 25.02.2017 10:00 - 11:00 | 0 | 0 | 0 | 0 |
| 25.02.2017 11:00 - 12:00 | 0 | 0 | 0 | 0 |
| 25.02.2017 12:00 - 13:00 | 0 | 0 | 0 | 0 |
| 25.02.2017 13:00 - 14:00 | 0 | 0 | 0 | 0 |
| 25.02.2017 14:00 - 15:00 | 0 | 0 | 0 | 0 |
| 25.02.2017 15:00 - 16:00 | 50 | 0 | 0 | 0 |
| 25.02.2017 16:00 - 17:00 | 50 | 0 | 0 | 0 |
| 25.02.2017 17:00 - 18:00 | 90 | 0 | 0 | 0 |
| 25.02.2017 18:00 - 19:00 | 110 | 0 | 0 | 0 |
| 25.02.2017 19:00 - 20:00 | 110 | 0 | 0 | 0 |
| 25.02.2017 20:00 - 21:00 | 110 | 0 | 0 | 0 |
| 25.02.2017 21:00 - 22:00 | 110 | 0 | 0 | 0 |
| 25.02.2017 22:00 - 23:00 | 110 | 0 | 0 | 0 |
| 25.02.2017 23:00 - 24:00 | 110 | 0 | 0 | 0 |
| 26.02.2017 00:00 - 01:00 | 110 | 0 | 0 | 0 |
| 26.02.2017 01:00 - 02:00 | 110 | 0 | 0 | 0 |
| 26.02.2017 02:00 - 03:00 | 110 | 0 | 0 | 0 |
| 26.02.2017 03:00 - 04:00 | 110 | 0 | 0 | 0 |
| 26.02.2017 04:00 - 05:00 | 110 | 0 | 0 | 0 |
| 26.02.2017 05:00 - 06:00 | 110 | 0 | 0 | 0 |
| 26.02.2017 06:00 - 07:00 | 100 | 0 | 0 | 0 |
| 26.02.2017 07:00 - 08:00 | 100 | 0 | 0 | 0 |
| 26.02.2017 08:00 - 09:00 | 100 | 0 | 0 | 0 |
| 26.02.2017 09:00 - 10:00 | 158 | 0 | 0 | 0 |
| 26.02.2017 10:00 - 11:00 | 158 | 0 | 0 | 0 |
| 26.02.2017 11:00 - 12:00 | 158 | 0 | 0 | 0 |
| 26.02.2017 12:00 - 13:00 | 158 | 0 | 0 | 0 |
| 26.02.2017 13:00 - 14:00 | 158 | 0 | 0 | 0 |
| 26.02.2017 14:00 - 15:00 | 158 | 0 | 0 | 0 |
| 26.02.2017 15:00 - 16:00 | 188 | 0 | 0 | 0 |
| 26.02.2017 16:00 - 17:00 | 188 | 0 | 0 | 0 |
| 26.02.2017 17:00 - 18:00 | 188 | 0 | 0 | 0 |
| 26.02.2017 18:00 - 19:00 | 188 | 0 | 0 | 0 |
| 26.02.2017 19:00 - 20:00 | 188 | 0 | 0 | 0 |
| 26.02.2017 20:00 - 21:00 | 188 | 0 | 0 | 0 |
| 26.02.2017 21:00 - 22:00 | 188 | 0 | 0 | 0 |
| 26.02.2017 22:00 - 23:00 | 188 | -100 | 0 | 0 |
| 26.02.2017 23:00 - 24:00 | 188 | -350 | 0 | 0 |
| 27.02.2017 00:00 - 01:00 | 188 | -400 | 0 | 0 |
| 27.02.2017 01:00 - 02:00 | 188 | -400 | 0 | 0 |
| 27.02.2017 02:00 - 03:00 | 188 | -400 | 0 | 0 |
| 27.02.2017 03:00 - 04:00 | 188 | -400 | 0 | 0 |
| 27.02.2017 04:00 - 05:00 | 288 | -400 | 0 | 0 |
| 27.02.2017 05:00 - 06:00 | 288 | -400 | 0 | 0 |
| 27.02.2017 06:00 - 07:00 | 100 | 0 | 0 | 0 |
| 27.02.2017 07:00 - 08:00 | 100 | 0 | 0 | 0 |
| 27.02.2017 08:00 - 09:00 | 200 | 0 | 0 | 0 |
| 27.02.2017 09:00 - 10:00 | 200 | 0 | 0 | 0 |
| 27.02.2017 10:00 - 11:00 | 200 | 0 | 0 | 0 |
| 27.02.2017 11:00 - 12:00 | 200 | 0 | 0 | 0 |
| 27.02.2017 12:00 - 13:00 | 200 | 0 | 0 | 0 |
| 27.02.2017 13:00 - 14:00 | 200 | -100 | 0 | 0 |
| 27.02.2017 14:00 - 15:00 | 200 | -100 | 0 | 0 |
| 27.02.2017 15:00 - 16:00 | 200 | -100 | 0 | 0 |
| 27.02.2017 16:00 - 17:00 | 200 | -100 | 0 | 0 |
| 27.02.2017 17:00 - 18:00 | 200 | -100 | 0 | 0 |
| 27.02.2017 18:00 - 19:00 | 200 | -100 | 0 | 0 |
| 27.02.2017 19:00 - 20:00 | 200 | -100 | 0 | 0 |
| 27.02.2017 20:00 - 21:00 | 200 | -230 | 0 | 0 |
| 27.02.2017 21:00 - 22:00 | 200 | -230 | 0 | 0 |
| 27.02.2017 22:00 - 23:00 | 200 | -230 | 0 | 0 |
| 27.02.2017 23:00 - 24:00 | 200 | -330 | 0 | 0 |
| 28.02.2017 00:00 - 01:00 | 200 | -430 | 0 | 0 |
| 28.02.2017 01:00 - 02:00 | 200 | -430 | 0 | 0 |
| 28.02.2017 02:00 - 03:00 | 200 | -430 | 0 | 0 |
| 28.02.2017 03:00 - 04:00 | 200 | -430 | 0 | 0 |
| 28.02.2017 04:00 - 05:00 | 274 | -430 | 0 | 0 |
| 28.02.2017 05:00 - 06:00 | 483 | -430 | 0 | 0 |
| 28.02.2017 06:00 - 07:00 | 120 | 0 | 0 | 0 |
| 28.02.2017 07:00 - 08:00 | 120 | 0 | 0 | 0 |
| 28.02.2017 08:00 - 09:00 | 170 | 0 | 0 | 0 |
| 28.02.2017 09:00 - 10:00 | 170 | 0 | 0 | 0 |
| 28.02.2017 10:00 - 11:00 | 170 | 0 | 0 | 0 |
| 28.02.2017 11:00 - 12:00 | 170 | 0 | 0 | 0 |
| 28.02.2017 12:00 - 13:00 | 170 | 0 | 0 | 0 |
| 28.02.2017 13:00 - 14:00 | 170 | 0 | 0 | 0 |
| 28.02.2017 14:00 - 15:00 | 170 | 0 | 0 | 0 |
| 28.02.2017 15:00 - 16:00 | 170 | 0 | 0 | 0 |
| 28.02.2017 16:00 - 17:00 | 170 | 0 | 0 | 0 |
| 28.02.2017 17:00 - 18:00 | 170 | 0 | 0 | 0 |
| 28.02.2017 18:00 - 19:00 | 170 | 0 | 0 | 0 |
| 28.02.2017 19:00 - 20:00 | 170 | 0 | 0 | 0 |
| 28.02.2017 20:00 - 21:00 | 170 | 0 | 0 | 0 |
| 28.02.2017 21:00 - 22:00 | 170 | 0 | 0 | 0 |
| 28.02.2017 22:00 - 23:00 | 170 | -50 | 0 | 0 |
| 28.02.2017 23:00 - 24:00 | 170 | -150 | 0 | 0 |
| 01.03.2017 00:00 - 01:00 | 170 | -200 | 0 | 0 |
| 01.03.2017 01:00 - 02:00 | 170 | -200 | 0 | 0 |
| 01.03.2017 02:00 - 03:00 | 170 | -290 | 0 | 0 |
| 01.03.2017 03:00 - 04:00 | 170 | -290 | 0 | 0 |
| 01.03.2017 04:00 - 05:00 | 170 | -290 | 0 | 0 |
| 01.03.2017 05:00 - 06:00 | 170 | -290 | 0 | 0 |